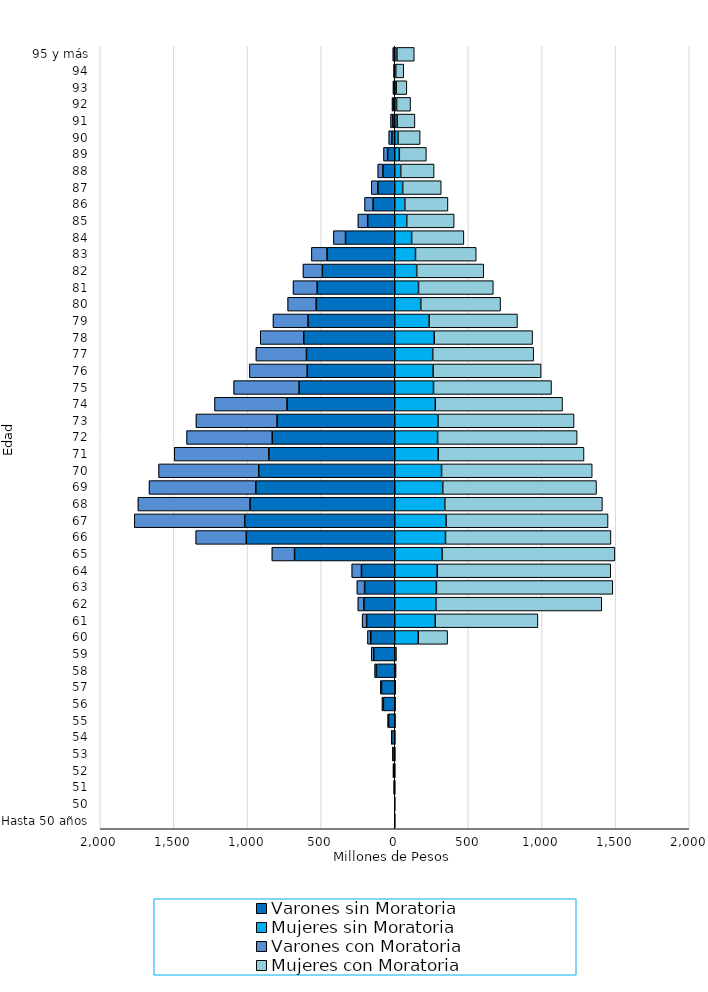
| Category | Varones sin Moratoria | Mujeres sin Moratoria | Varones con Moratoria | Mujeres con Moratoria |
|---|---|---|---|---|
| Hasta 50 años | -1156187 | 561391 | -51823 | 83106 |
| 50 | -1387356 | 504150 | -29837 | 25911 |
| 51 | -5136682 | 913549 | -127473 | 44501 |
| 52 | -10362066 | 1179350 | -256978 | 118594 |
| 53 | -13750636 | 1514950 | -416391 | 116544 |
| 54 | -21474274 | 1741594 | -1363132 | 246295 |
| 55 | -41456288 | 3011001 | -6343895 | 380466 |
| 56 | -76848144 | 3364249 | -9734594 | 753508 |
| 57 | -90178749 | 4528905 | -7636474 | 1024272 |
| 58 | -124800424 | 6704380 | -11669119 | 1313981 |
| 59 | -142810297 | 8377188 | -16503223 | 2194210 |
| 60 | -162929766 | 159627015 | -22331009 | 199309439 |
| 61 | -190873950 | 274841144 | -30538469 | 697331892 |
| 62 | -209514456 | 279451890 | -41035386 | 1126264617 |
| 63 | -204717340 | 282592786 | -52096056 | 1198261439 |
| 64 | -226088769 | 288559120 | -65927234 | 1178231206 |
| 65 | -680524949 | 321552116 | -154019760 | 1173481126 |
| 66 | -1008107146 | 344744726 | -343489237 | 1123416154 |
| 67 | -1018814155 | 348511616 | -749871162 | 1099940470 |
| 68 | -982926516 | 339600912 | -761164568 | 1070559705 |
| 69 | -943387782 | 325925522 | -725198152 | 1044277779 |
| 70 | -923757624 | 317931314 | -680095296 | 1023025970 |
| 71 | -854998026 | 295194130 | -642156132 | 990105117 |
| 72 | -832080226 | 291240776 | -581713808 | 947403770 |
| 73 | -799370294 | 293858198 | -550728583 | 923997159 |
| 74 | -731646780 | 275275200 | -492154272 | 864146235 |
| 75 | -649712079 | 263269146 | -444465538 | 801368924 |
| 76 | -594987509 | 260371189 | -392228278 | 733451606 |
| 77 | -599497716 | 257826484 | -343398678 | 685636520 |
| 78 | -617965095 | 268014269 | -295507170 | 668084681 |
| 79 | -589120597 | 233598095 | -237627112 | 599706520 |
| 80 | -533508937 | 176548655 | -193814210 | 542042867 |
| 81 | -526848754 | 161477223 | -163788872 | 507870146 |
| 82 | -491663416 | 149089892 | -131495537 | 455005962 |
| 83 | -459816500 | 140899647 | -106202720 | 412496205 |
| 84 | -334373203 | 114805324 | -82275222 | 354736804 |
| 85 | -183789339 | 81427480 | -66324402 | 322184155 |
| 86 | -147088761 | 68254904 | -57795472 | 292987010 |
| 87 | -114531809 | 53896042 | -44884090 | 261771283 |
| 88 | -80174864 | 40437965 | -35154134 | 226734511 |
| 89 | -48334691 | 31053397 | -27934947 | 183626860 |
| 90 | -19546711 | 21812033 | -21018831 | 150522267 |
| 91 | -12954445 | 16174489 | -15298988 | 120900606 |
| 92 | -7128191 | 12613914 | -11141342 | 94771140 |
| 93 | -4412010 | 9967350 | -7376672 | 72156195 |
| 94 | -2186643 | 6750375 | -5081031 | 54261062 |
| 95 y más | -3214862 | 14573695 | -9735683 | 117997718 |